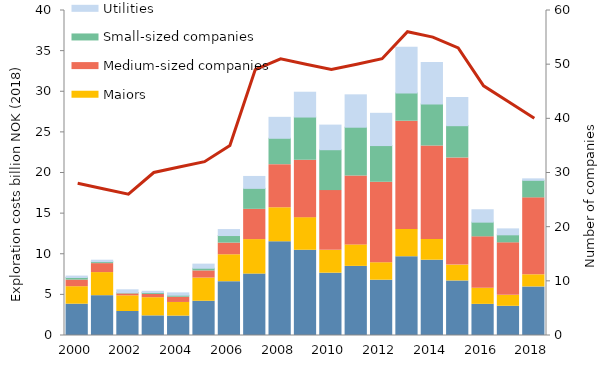
| Category | Large Norwegian companies | Majors | Medium-sized companies | Small-sized companies | Utilities |
|---|---|---|---|---|---|
| 2000.0 | 3.857 | 2.15 | 0.811 | 0.324 | 0.173 |
| 2001.0 | 4.902 | 2.841 | 1.104 | 0.24 | 0.179 |
| 2002.0 | 2.956 | 1.928 | 0.235 | 0.166 | 0.338 |
| 2003.0 | 2.414 | 2.24 | 0.393 | 0.228 | 0.162 |
| 2004.0 | 2.388 | 1.678 | 0.643 | 0.247 | 0.29 |
| 2005.0 | 4.216 | 2.853 | 0.883 | 0.327 | 0.505 |
| 2006.0 | 6.623 | 3.313 | 1.438 | 0.929 | 0.735 |
| 2007.0 | 7.563 | 4.241 | 3.723 | 2.582 | 1.466 |
| 2008.0 | 11.536 | 4.185 | 5.306 | 3.245 | 2.579 |
| 2009.0 | 10.492 | 4.012 | 7.074 | 5.309 | 3.054 |
| 2010.0 | 7.671 | 2.807 | 7.359 | 5.028 | 3.031 |
| 2011.0 | 8.507 | 2.644 | 8.47 | 6.014 | 3.985 |
| 2012.0 | 6.808 | 2.15 | 9.902 | 4.517 | 3.97 |
| 2013.0 | 9.696 | 3.363 | 13.313 | 3.481 | 5.619 |
| 2014.0 | 9.269 | 2.556 | 11.511 | 5.17 | 5.094 |
| 2015.0 | 6.715 | 1.948 | 13.19 | 3.969 | 3.467 |
| 2016.0 | 3.833 | 1.983 | 6.327 | 1.807 | 1.525 |
| 2017.0 | 3.595 | 1.344 | 6.467 | 0.983 | 0.73 |
| 2018.0 | 5.979 | 1.492 | 9.468 | 2.157 | 0.183 |